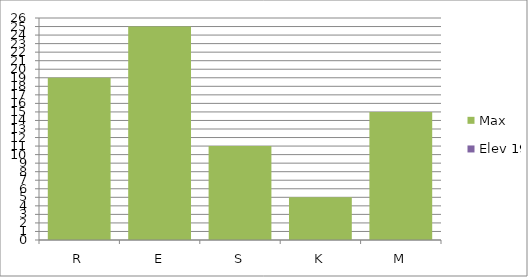
| Category | Max | Elev 19 |
|---|---|---|
| R | 19 | 0 |
| E | 25 | 0 |
| S | 11 | 0 |
| K | 5 | 0 |
| M | 15 | 0 |